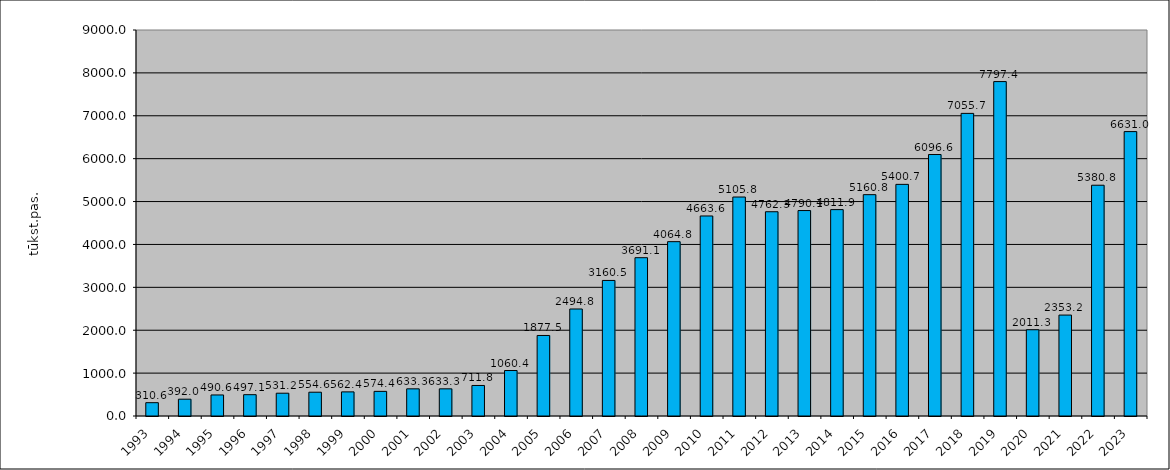
| Category | Series 1 |
|---|---|
| 1993.0 | 310.6 |
| 1994.0 | 392 |
| 1995.0 | 490.62 |
| 1996.0 | 497.13 |
| 1997.0 | 531.22 |
| 1998.0 | 554.62 |
| 1999.0 | 562.383 |
| 2000.0 | 574.356 |
| 2001.0 | 633.319 |
| 2002.0 | 633.319 |
| 2003.0 | 711.848 |
| 2004.0 | 1060.384 |
| 2005.0 | 1877.461 |
| 2006.0 | 2494.835 |
| 2007.0 | 3160.535 |
| 2008.0 | 3691.099 |
| 2009.0 | 4064.755 |
| 2010.0 | 4663.647 |
| 2011.0 | 5105.818 |
| 2012.0 | 4762.335 |
| 2013.0 | 4790.136 |
| 2014.0 | 4811.949 |
| 2015.0 | 5160.759 |
| 2016.0 | 5400.709 |
| 2017.0 | 6096.62 |
| 2018.0 | 7055.734 |
| 2019.0 | 7797.398 |
| 2020.0 | 2011.274 |
| 2021.0 | 2353.246 |
| 2022.0 | 5380.812 |
| 2023.0 | 6630.965 |